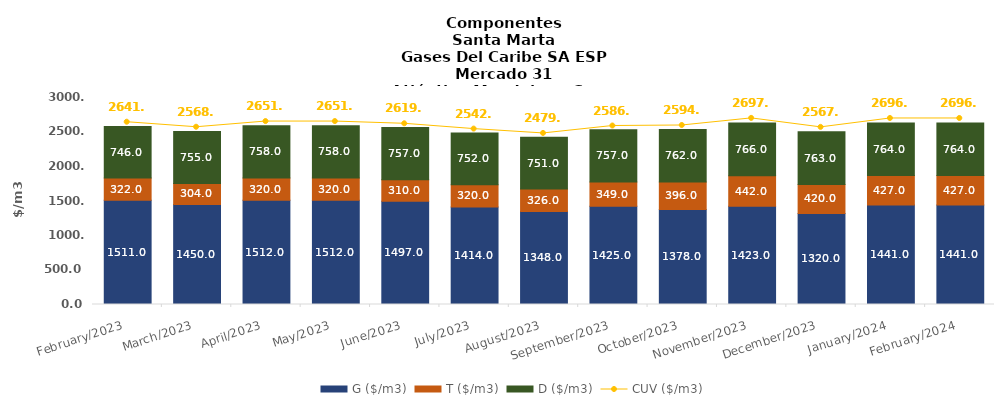
| Category | G ($/m3) | T ($/m3) | D ($/m3) |
|---|---|---|---|
| 2023-02-01 | 1511 | 322 | 746 |
| 2023-03-01 | 1450 | 304 | 755 |
| 2023-04-01 | 1512 | 320 | 758 |
| 2023-05-01 | 1512 | 320 | 758 |
| 2023-06-01 | 1497 | 310 | 757 |
| 2023-07-01 | 1414 | 320 | 752 |
| 2023-08-01 | 1348 | 326 | 751 |
| 2023-09-01 | 1425 | 349 | 757 |
| 2023-10-01 | 1378 | 396 | 762 |
| 2023-11-01 | 1423 | 442 | 766 |
| 2023-12-01 | 1320 | 420 | 763 |
| 2024-01-01 | 1441 | 427 | 764 |
| 2024-02-01 | 1441 | 427 | 764 |